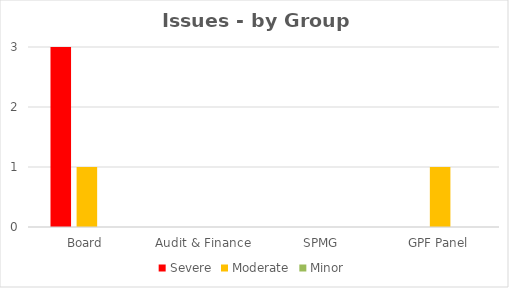
| Category | Severe | Moderate | Minor |
|---|---|---|---|
| Board | 3 | 1 | 0 |
| Audit & Finance | 0 | 0 | 0 |
| SPMG | 0 | 0 | 0 |
| GPF Panel | 0 | 1 | 0 |